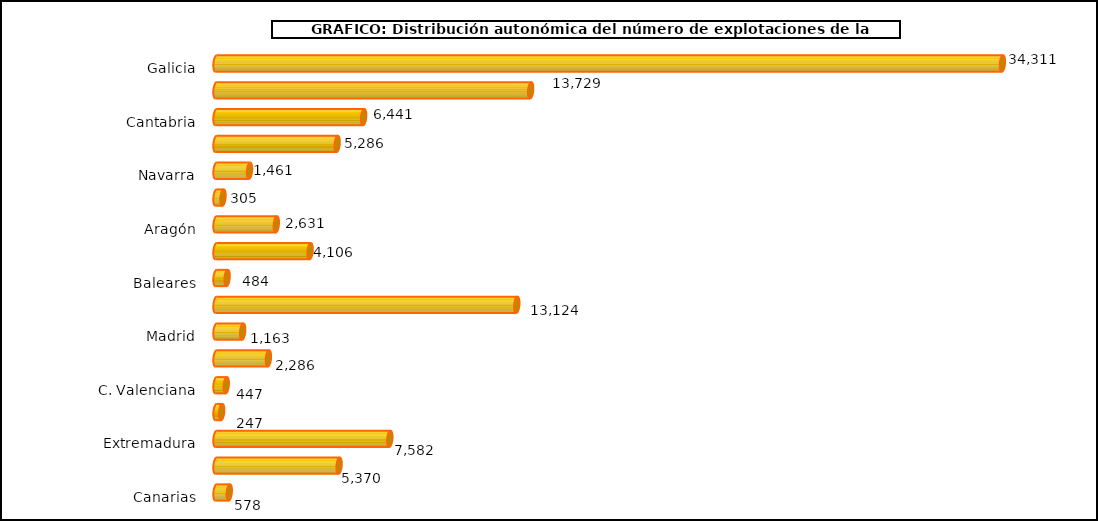
| Category | num. Explotaciones |
|---|---|
|   Galicia | 34311 |
|   P. de Asturias | 13729 |
|   Cantabria | 6441 |
|   País Vasco | 5286 |
|   Navarra | 1461 |
|   La Rioja | 305 |
|   Aragón | 2631 |
|   Cataluña | 4106 |
|   Baleares | 484 |
|   Castilla y León | 13124 |
|   Madrid | 1163 |
|   Castilla – La Mancha | 2286 |
|   C. Valenciana | 447 |
|   R. de Murcia | 247 |
|   Extremadura | 7582 |
|   Andalucía | 5370 |
|   Canarias | 578 |